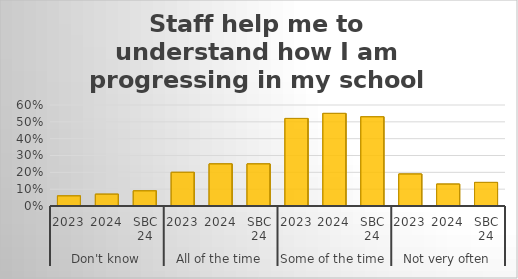
| Category | Staff help me to understand how I am progressing in my school work. |
|---|---|
| 0 | 0.06 |
| 1 | 0.07 |
| 2 | 0.09 |
| 3 | 0.2 |
| 4 | 0.25 |
| 5 | 0.25 |
| 6 | 0.52 |
| 7 | 0.55 |
| 8 | 0.53 |
| 9 | 0.19 |
| 10 | 0.13 |
| 11 | 0.14 |